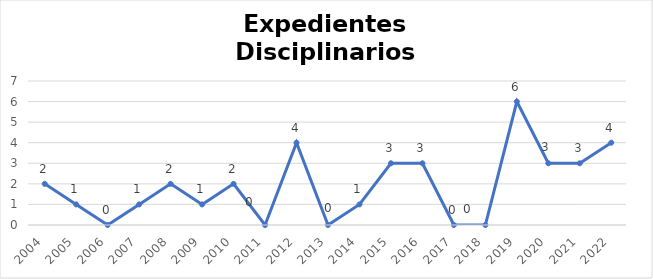
| Category | Expedientes Disciplinarios |
|---|---|
| 2004.0 | 2 |
| 2005.0 | 1 |
| 2006.0 | 0 |
| 2007.0 | 1 |
| 2008.0 | 2 |
| 2009.0 | 1 |
| 2010.0 | 2 |
| 2011.0 | 0 |
| 2012.0 | 4 |
| 2013.0 | 0 |
| 2014.0 | 1 |
| 2015.0 | 3 |
| 2016.0 | 3 |
| 2017.0 | 0 |
| 2018.0 | 0 |
| 2019.0 | 6 |
| 2020.0 | 3 |
| 2021.0 | 3 |
| 2022.0 | 4 |